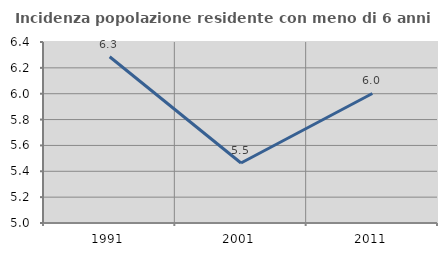
| Category | Incidenza popolazione residente con meno di 6 anni |
|---|---|
| 1991.0 | 6.286 |
| 2001.0 | 5.464 |
| 2011.0 | 6.002 |